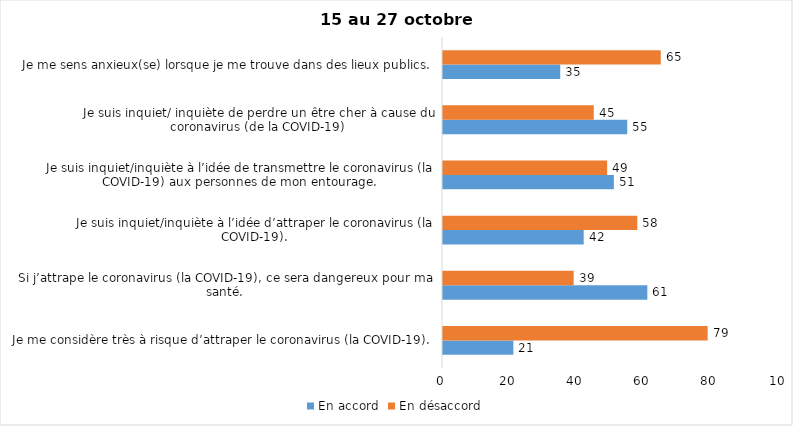
| Category | En accord | En désaccord |
|---|---|---|
| Je me considère très à risque d’attraper le coronavirus (la COVID-19). | 21 | 79 |
| Si j’attrape le coronavirus (la COVID-19), ce sera dangereux pour ma santé. | 61 | 39 |
| Je suis inquiet/inquiète à l’idée d’attraper le coronavirus (la COVID-19). | 42 | 58 |
| Je suis inquiet/inquiète à l’idée de transmettre le coronavirus (la COVID-19) aux personnes de mon entourage. | 51 | 49 |
| Je suis inquiet/ inquiète de perdre un être cher à cause du coronavirus (de la COVID-19) | 55 | 45 |
| Je me sens anxieux(se) lorsque je me trouve dans des lieux publics. | 35 | 65 |